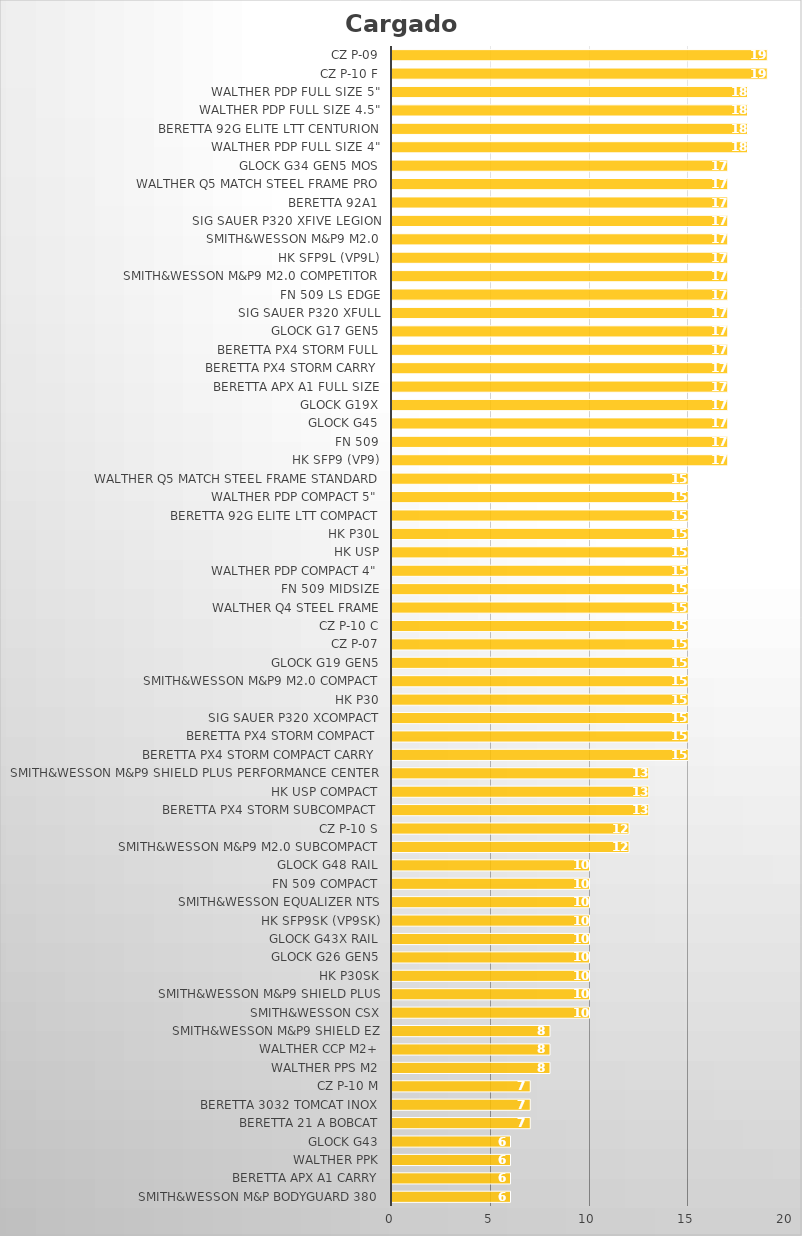
| Category | Cargador |
|---|---|
| Smith&Wesson M&P Bodyguard 380 | 6 |
| Beretta APX A1 Carry | 6 |
| Walther PPK | 6 |
| Glock G43 | 6 |
| Beretta 21 A Bobcat | 7 |
| Beretta 3032 Tomcat Inox | 7 |
| CZ P-10 M | 7 |
| Walther PPS M2 | 8 |
| Walther CCP M2+ | 8 |
| Smith&Wesson M&P9 Shield EZ | 8 |
| Smith&Wesson CSX | 10 |
| Smith&Wesson M&P9 Shield Plus | 10 |
| HK P30SK | 10 |
| Glock G26 Gen5 | 10 |
| Glock G43X Rail | 10 |
| HK SFP9SK (VP9SK) | 10 |
| Smith&Wesson Equalizer NTS | 10 |
| FN 509 Compact | 10 |
| Glock G48 Rail | 10 |
| Smith&Wesson M&P9 M2.0 Subcompact | 12 |
| CZ P-10 S | 12 |
| Beretta Px4 Storm SubCompact | 13 |
| HK USP Compact | 13 |
| Smith&Wesson M&P9 Shield Plus Performance Center | 13 |
| Beretta Px4 Storm Compact Carry | 15 |
| Beretta Px4 Storm Compact | 15 |
| SIG Sauer P320 XCOMPACT | 15 |
| HK P30 | 15 |
| Smith&Wesson M&P9 M2.0 Compact | 15 |
| Glock G19 Gen5 | 15 |
| CZ P-07 | 15 |
| CZ P-10 C | 15 |
| Walther Q4 Steel Frame | 15 |
| FN 509 Midsize | 15 |
| Walther PDP Compact 4" | 15 |
| HK USP | 15 |
| HK P30L | 15 |
| Beretta 92G Elite LTT Compact | 15 |
| Walther PDP Compact 5" | 15 |
| Walther Q5 Match Steel Frame Standard | 15 |
| HK SFP9 (VP9) | 17 |
| FN 509 | 17 |
| Glock G45 | 17 |
| Glock G19X | 17 |
| Beretta APX A1 Full Size | 17 |
| Beretta Px4 Storm Carry | 17 |
| Beretta Px4 Storm Full | 17 |
| Glock G17 Gen5 | 17 |
| SIG Sauer P320 XFULL | 17 |
| FN 509 LS Edge | 17 |
| Smith&Wesson M&P9 M2.0 Competitor | 17 |
| HK SFP9L (VP9L) | 17 |
| Smith&Wesson M&P9 M2.0 | 17 |
| SIG Sauer P320 XFIVE Legion | 17 |
| Beretta 92A1 | 17 |
| Walther Q5 Match Steel Frame Pro | 17 |
| Glock G34 Gen5 MOS | 17 |
| Walther PDP Full Size 4" | 18 |
| Beretta 92G Elite LTT Centurion | 18 |
| Walther PDP Full Size 4.5" | 18 |
| Walther PDP Full Size 5" | 18 |
| CZ P-10 F | 19 |
| CZ P-09 | 19 |